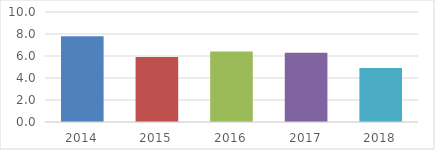
| Category | COBERTURA DE BECADOS EXTERNOS (%) |
|---|---|
| 2014.0 | 7.8 |
| 2015.0 | 5.9 |
| 2016.0 | 6.4 |
| 2017.0 | 6.3 |
| 2018.0 | 4.91 |